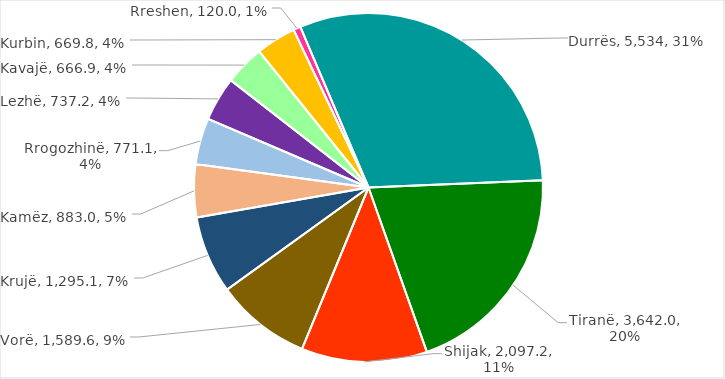
| Category | Vlera në milion lekë | Pjesa ndaj Total Grante |
|---|---|---|
| Durrës | 5534.132 | 0.307 |
| Tiranë | 3642.007 | 0.202 |
| Shijak | 2097.161 | 0.116 |
| Vorë | 1589.576 | 0.088 |
| Krujë | 1295.092 | 0.072 |
| Kamëz | 883.044 | 0.049 |
| Rrogozhinë | 771.097 | 0.043 |
| Lezhë | 737.191 | 0.041 |
| Kavajë | 666.938 | 0.037 |
| Kurbin | 669.767 | 0.037 |
| Rreshen | 119.963 | 0.007 |